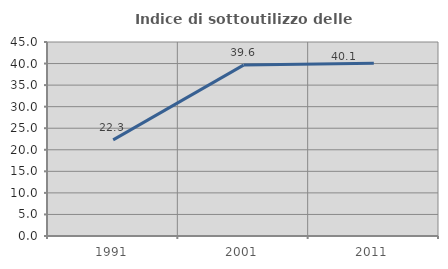
| Category | Indice di sottoutilizzo delle abitazioni  |
|---|---|
| 1991.0 | 22.291 |
| 2001.0 | 39.645 |
| 2011.0 | 40.058 |